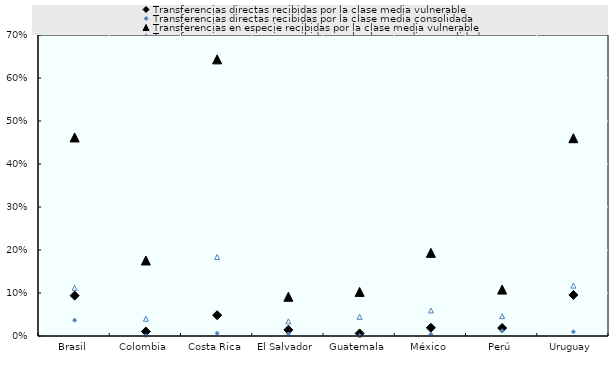
| Category | Transferencias directas recibidas por la clase media vulnerable  | Transferencias directas recibidas por la clase media consolidada  | Transferencias en especie recibidas por la clase media vulnerable | Transferencias en especie recibidas por la clase media consolidada |
|---|---|---|---|---|
| Brasil | 0.094 | 0.036 | 0.462 | 0.112 |
| Colombia | 0.011 | 0.001 | 0.176 | 0.04 |
| Costa Rica | 0.048 | 0.006 | 0.643 | 0.184 |
| El Salvador | 0.014 | 0.005 | 0.091 | 0.034 |
| Guatemala | 0.006 | 0.001 | 0.103 | 0.045 |
| México | 0.019 | 0.004 | 0.193 | 0.059 |
| Perú | 0.019 | 0.012 | 0.108 | 0.046 |
| Uruguay | 0.095 | 0.01 | 0.46 | 0.117 |